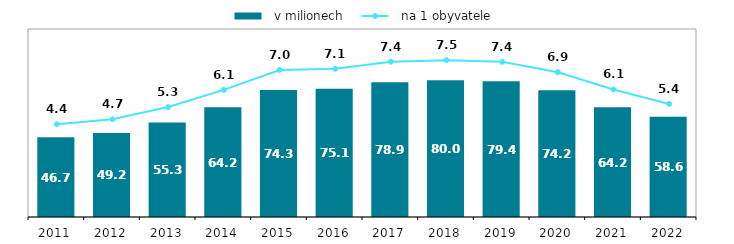
| Category |   v milionech |
|---|---|
| 2011.0 | 46.679 |
| 2012.0 | 49.196 |
| 2013.0 | 55.323 |
| 2014.0 | 64.151 |
| 2015.0 | 74.303 |
| 2016.0 | 75.052 |
| 2017.0 | 78.883 |
| 2018.0 | 79.977 |
| 2019.0 | 79.419 |
| 2020.0 | 74.19 |
| 2021.0 | 64.199 |
| 2022.0 | 58.614 |